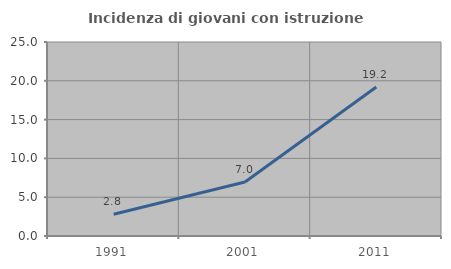
| Category | Incidenza di giovani con istruzione universitaria |
|---|---|
| 1991.0 | 2.804 |
| 2001.0 | 6.96 |
| 2011.0 | 19.2 |